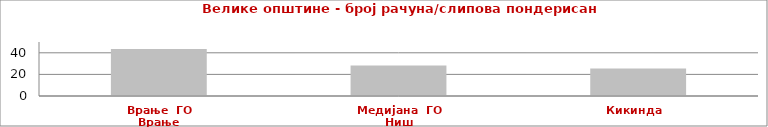
| Category | Series 0 |
|---|---|
| Врање  ГО Врање | 43.496 |
| Медијана  ГО Ниш | 28.349 |
| Кикинда   | 25.424 |